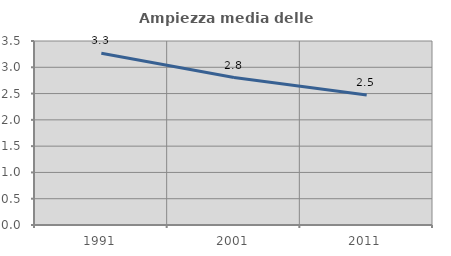
| Category | Ampiezza media delle famiglie |
|---|---|
| 1991.0 | 3.266 |
| 2001.0 | 2.805 |
| 2011.0 | 2.475 |